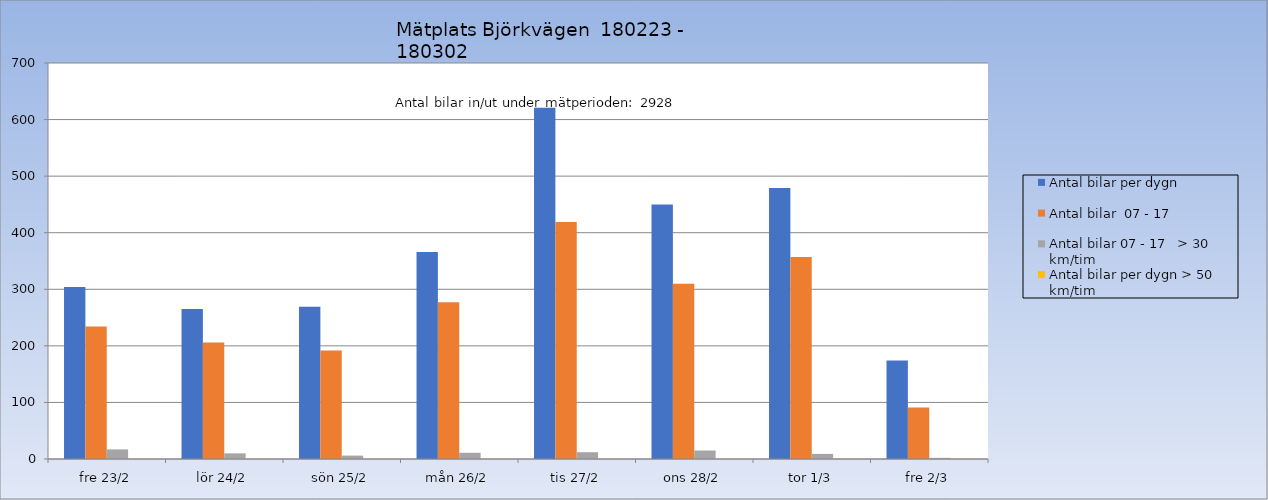
| Category | Antal bilar per dygn | Antal bilar  07 - 17 | Antal bilar 07 - 17   > 30 km/tim | Antal bilar per dygn > 50 km/tim |
|---|---|---|---|---|
| fre 23/2 | 304 | 234 | 17 | 0 |
| lör 24/2 | 265 | 206 | 10 | 0 |
| sön 25/2 | 269 | 192 | 6 | 0 |
| mån 26/2 | 366 | 277 | 11 | 0 |
| tis 27/2 | 621 | 419 | 12 | 0 |
| ons 28/2 | 450 | 310 | 15 | 0 |
| tor 1/3 | 479 | 357 | 9 | 0 |
| fre 2/3 | 174 | 91 | 2 | 0 |